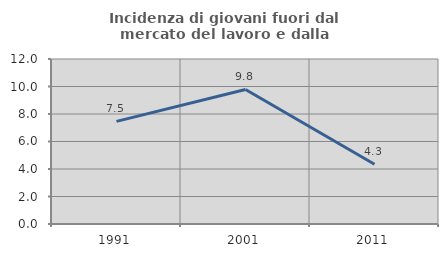
| Category | Incidenza di giovani fuori dal mercato del lavoro e dalla formazione  |
|---|---|
| 1991.0 | 7.463 |
| 2001.0 | 9.783 |
| 2011.0 | 4.348 |